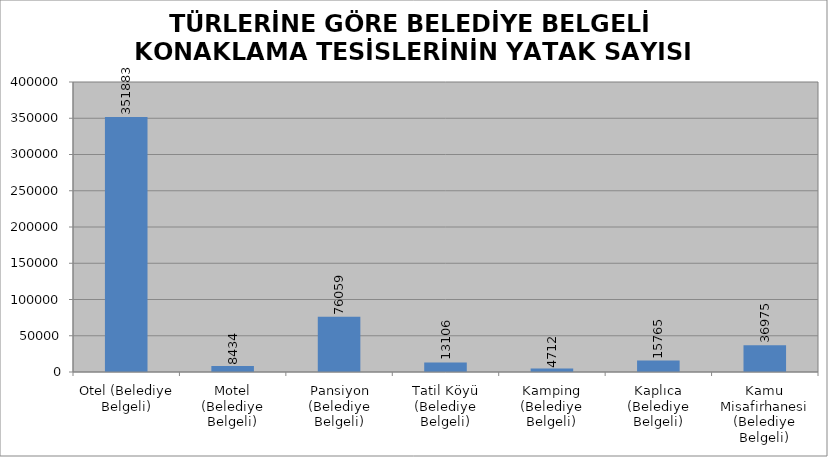
| Category | BELEDİYE BELGELİ TESİSLER |
|---|---|
| Otel (Belediye Belgeli) | 351883 |
| Motel (Belediye Belgeli) | 8434 |
| Pansiyon (Belediye Belgeli) | 76059 |
| Tatil Köyü (Belediye Belgeli) | 13106 |
| Kamping (Belediye Belgeli) | 4712 |
| Kaplıca (Belediye Belgeli) | 15765 |
| Kamu Misafirhanesi (Belediye Belgeli) | 36975 |